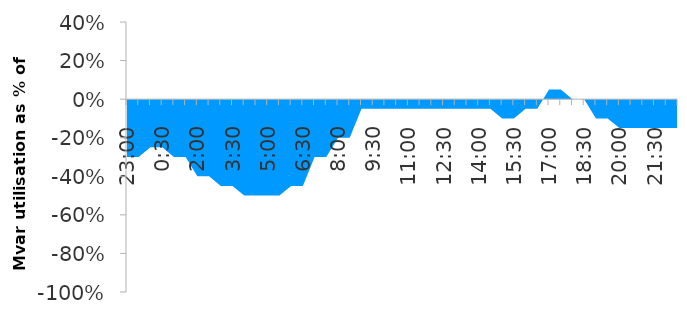
| Category | Series 0 |
|---|---|
| 0.9583333333333334 | -0.3 |
| 0.9791666666666666 | -0.3 |
| 0.0 | -0.25 |
| 0.020833333333333332 | -0.25 |
| 0.041666666666666664 | -0.3 |
| 0.0625 | -0.3 |
| 0.08333333333333333 | -0.4 |
| 0.10416666666666667 | -0.4 |
| 0.125 | -0.45 |
| 0.14583333333333334 | -0.45 |
| 0.16666666666666666 | -0.5 |
| 0.1875 | -0.5 |
| 0.20833333333333334 | -0.5 |
| 0.22916666666666666 | -0.5 |
| 0.25 | -0.45 |
| 0.2708333333333333 | -0.45 |
| 0.2916666666666667 | -0.3 |
| 0.3125 | -0.3 |
| 0.3333333333333333 | -0.2 |
| 0.3541666666666667 | -0.2 |
| 0.375 | -0.05 |
| 0.3958333333333333 | -0.05 |
| 0.4166666666666667 | -0.05 |
| 0.4375 | -0.05 |
| 0.4583333333333333 | -0.05 |
| 0.4791666666666667 | -0.05 |
| 0.5 | -0.05 |
| 0.5208333333333334 | -0.05 |
| 0.5416666666666666 | -0.05 |
| 0.5625 | -0.05 |
| 0.5833333333333334 | -0.05 |
| 0.6041666666666666 | -0.05 |
| 0.625 | -0.1 |
| 0.6458333333333334 | -0.1 |
| 0.6666666666666666 | -0.05 |
| 0.6875 | -0.05 |
| 0.7083333333333334 | 0.05 |
| 0.7291666666666666 | 0.05 |
| 0.75 | 0 |
| 0.7708333333333334 | 0 |
| 0.7916666666666666 | -0.1 |
| 0.8125 | -0.1 |
| 0.8333333333333334 | -0.15 |
| 0.8541666666666666 | -0.15 |
| 0.875 | -0.15 |
| 0.8958333333333334 | -0.15 |
| 0.9166666666666666 | -0.15 |
| 0.9375 | -0.15 |